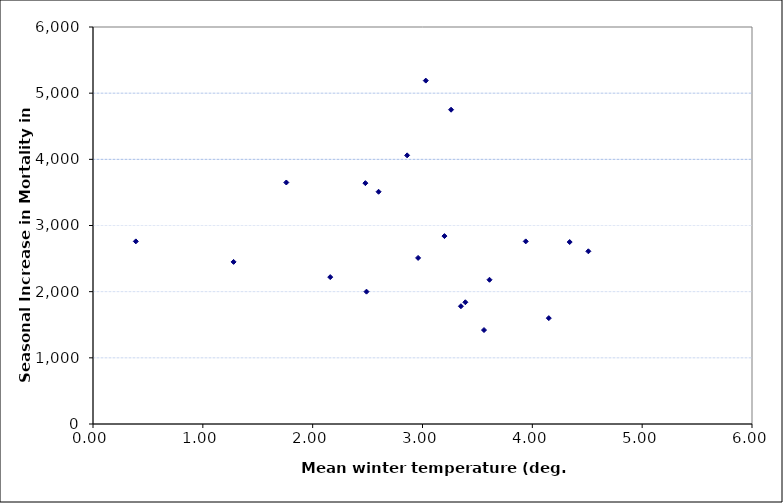
| Category | Seas Incr. Mort. |
|---|---|
| 1.76 | 3650 |
| 2.48 | 3640 |
| 4.51 | 2610 |
| 3.26 | 4750 |
| 3.03 | 5190 |
| 2.16 | 2220 |
| 3.39 | 1840 |
| 2.96 | 2510 |
| 3.2 | 2840 |
| 3.94 | 2760 |
| 3.35 | 1780 |
| 4.34 | 2750 |
| 3.61 | 2180 |
| 2.6 | 3510 |
| 0.39 | 2760 |
| 1.28 | 2450 |
| 3.56 | 1420 |
| 2.49 | 2000 |
| 4.15 | 1600 |
| 2.86 | 4060 |